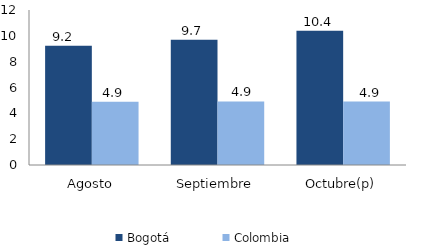
| Category | Bogotá | Colombia |
|---|---|---|
| Agosto | 9.227 | 4.903 |
| Septiembre | 9.695 | 4.925 |
| Octubre(p) | 10.387 | 4.915 |